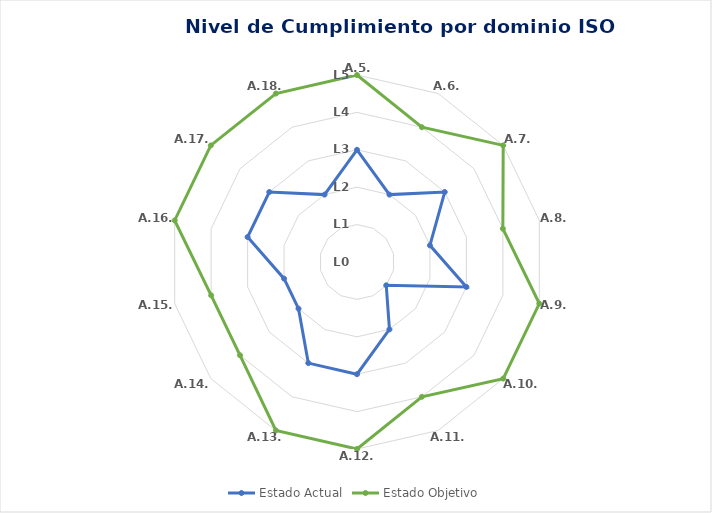
| Category | Estado Actual | Estado Objetivo |
|---|---|---|
| A.5. | 3 | 5 |
| A.6. | 2 | 4 |
| A.7. | 3 | 5 |
| A.8. | 2 | 4 |
| A.9. | 3 | 5 |
| A.10. | 1 | 5 |
| A.11. | 2 | 4 |
| A.12. | 3 | 5 |
| A.13. | 3 | 5 |
| A.14. | 2 | 4 |
| A.15. | 2 | 4 |
| A.16. | 3 | 5 |
| A.17. | 3 | 5 |
| A.18. | 2 | 5 |